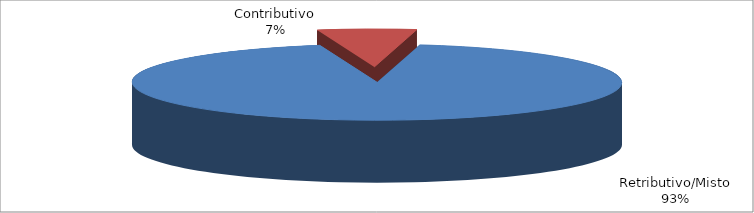
| Category | Series 1 |
|---|---|
| Retributivo/Misto | 244724 |
| Contributivo | 17095 |